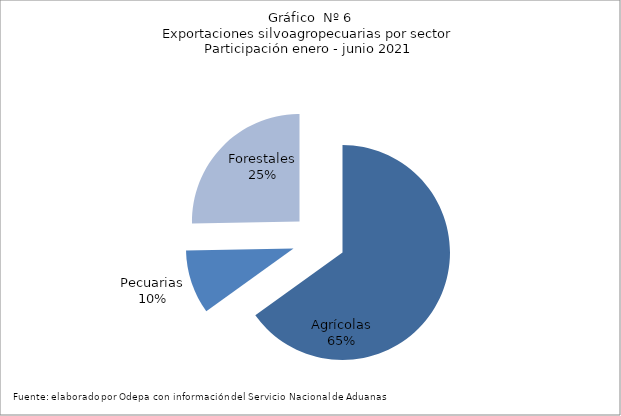
| Category | Series 0 |
|---|---|
| Agrícolas | 5941883 |
| Pecuarias | 880874 |
| Forestales | 2310431 |